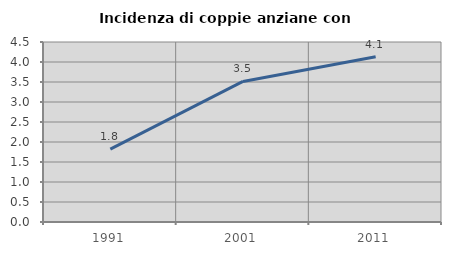
| Category | Incidenza di coppie anziane con figli |
|---|---|
| 1991.0 | 1.822 |
| 2001.0 | 3.514 |
| 2011.0 | 4.13 |